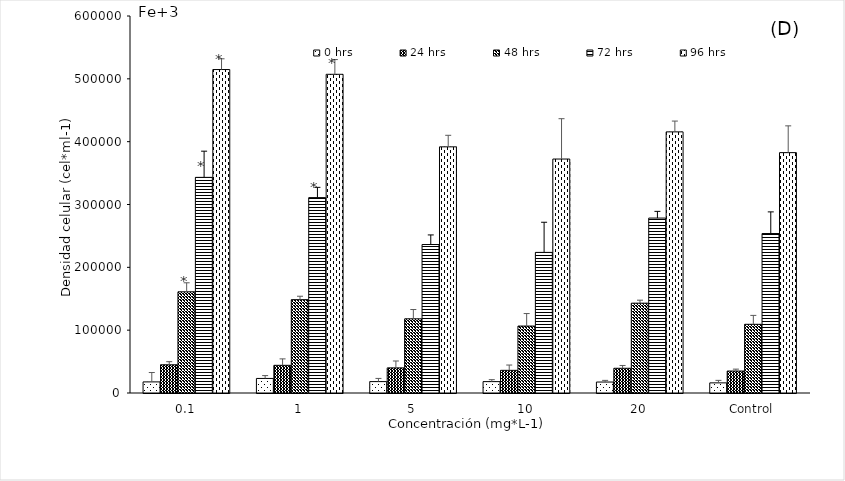
| Category | 0 hrs | 24 hrs | 48 hrs | 72 hrs | 96 hrs |
|---|---|---|---|---|---|
| 0,1 | 17669.334 | 44899.232 | 161032.11 | 343191.925 | 514794.625 |
| 1 | 23160.771 | 44046.64 | 148544.886 | 310980.35 | 507214.833 |
| 5 | 18137.692 | 39982.751 | 118044.258 | 236290.72 | 391774.521 |
| 10 | 18124.338 | 36075.677 | 106553.986 | 223770.185 | 372359.537 |
| 20 | 17432.465 | 39354.441 | 142956.755 | 278390.667 | 415607.627 |
| Control | 16119.13 | 34946.458 | 109340.935 | 253789.818 | 382551.841 |